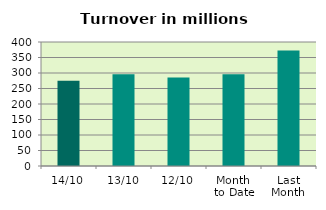
| Category | Series 0 |
|---|---|
| 14/10 | 274.613 |
| 13/10 | 296.332 |
| 12/10 | 285.558 |
| Month 
to Date | 295.941 |
| Last
Month | 372.713 |